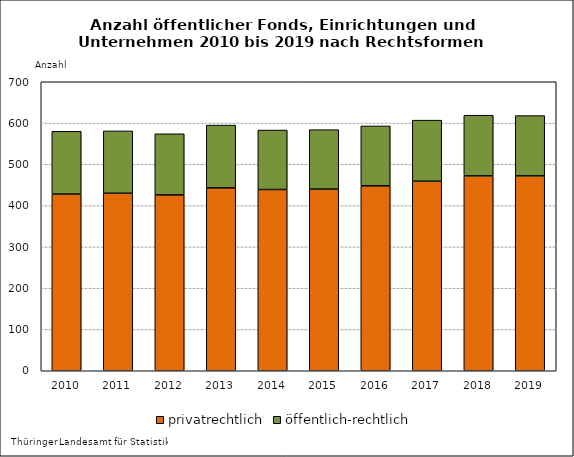
| Category | privatrechtlich | öffentlich-rechtlich |
|---|---|---|
| 2010.0 | 428 | 152 |
| 2011.0 | 430 | 151 |
| 2012.0 | 426 | 148 |
| 2013.0 | 443 | 152 |
| 2014.0 | 439 | 144 |
| 2015.0 | 440 | 144 |
| 2016.0 | 448 | 145 |
| 2017.0 | 459 | 148 |
| 2018.0 | 472 | 147 |
| 2019.0 | 472 | 146 |